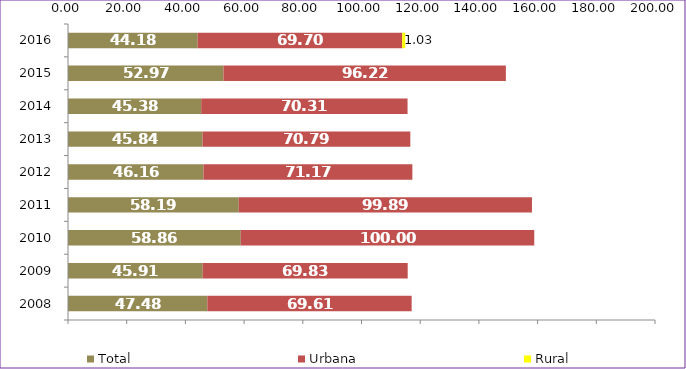
| Category | Total | Urbana | Rural |
|---|---|---|---|
| 2008.0 | 47.48 | 69.61 | 0 |
| 2009.0 | 45.91 | 69.83 | 0 |
| 2010.0 | 58.86 | 100 | 0 |
| 2011.0 | 58.19 | 99.89 | 0 |
| 2012.0 | 46.16 | 71.17 | 0 |
| 2013.0 | 45.84 | 70.79 | 0 |
| 2014.0 | 45.38 | 70.31 | 0 |
| 2015.0 | 52.97 | 96.22 | 0 |
| 2016.0 | 44.18 | 69.7 | 1.03 |